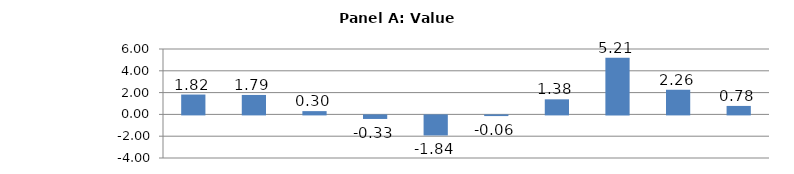
| Category | Series 0 |
|---|---|
| Crop and animal production | 1.821 |
| Wood product manufacturing | 1.785 |
| Forestry and logging | 0.3 |
| Paper manufacturing | -0.326 |
| Fishing, hunting and trapping | -1.839 |
| Mining (except oil and gas) | -0.061 |
| Support activities for agriculture and forestry | 1.382 |
| Support activities for mining and oil and gas | 5.206 |
| Oil and gas extraction | 2.261 |
| Petroleum and coal products manufacturing | 0.777 |